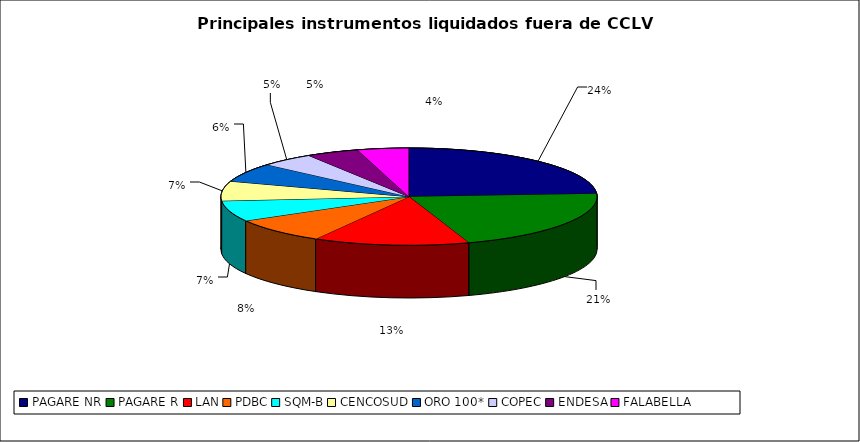
| Category | Series 0 |
|---|---|
| PAGARE NR | 1670 |
| PAGARE R | 1442 |
| LAN | 931 |
| PDBC | 588 |
| SQM-B | 478 |
| CENCOSUD | 451 |
| ORO 100* | 436 |
| COPEC | 321 |
| ENDESA | 314 |
| FALABELLA | 307 |